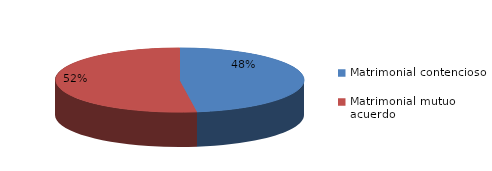
| Category | Series 0 |
|---|---|
| 0 | 708 |
| 1 | 774 |